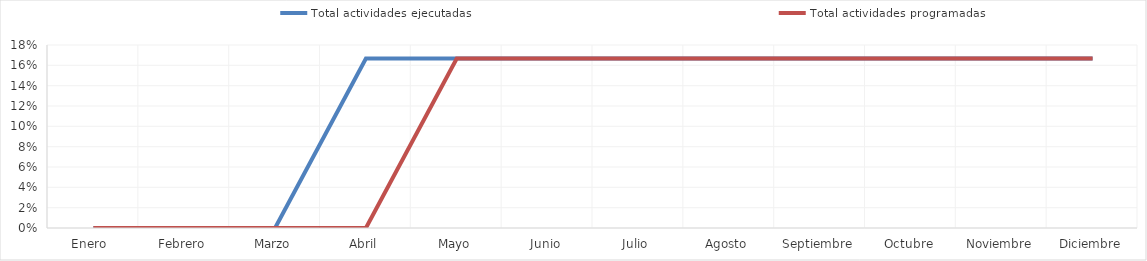
| Category | Total actividades ejecutadas  | Total actividades programadas |
|---|---|---|
| Enero  | 0 | 0 |
| Febrero | 0 | 0 |
| Marzo | 0 | 0 |
| Abril | 0.167 | 0 |
| Mayo | 0.167 | 0.167 |
| Junio | 0.167 | 0.167 |
| Julio | 0.167 | 0.167 |
| Agosto | 0.167 | 0.167 |
| Septiembre | 0.167 | 0.167 |
| Octubre | 0.167 | 0.167 |
| Noviembre | 0.167 | 0.167 |
| Diciembre | 0.167 | 0.167 |